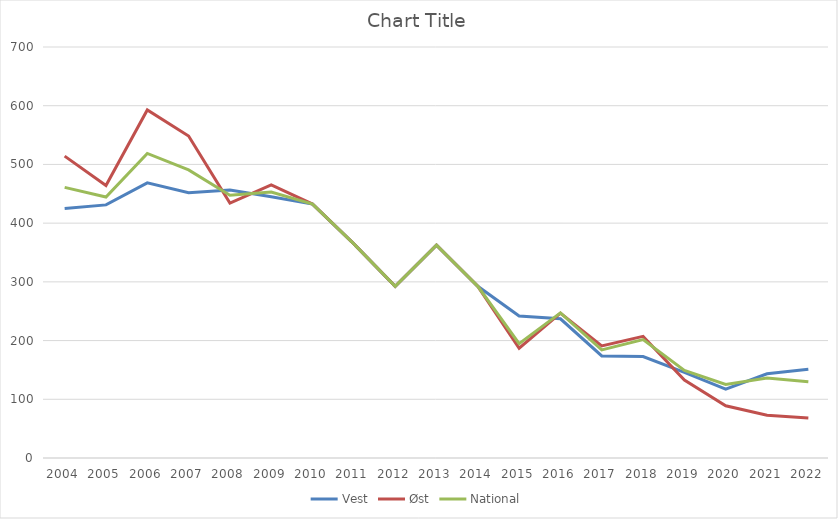
| Category | Vest | Øst | National |
|---|---|---|---|
| 2004.0 | 424.918 | 514.116 | 460.923 |
| 2005.0 | 431.078 | 464.007 | 444.381 |
| 2006.0 | 468.603 | 592.729 | 518.732 |
| 2007.0 | 451.824 | 548.369 | 490.629 |
| 2008.0 | 456.563 | 434.166 | 447.566 |
| 2009.0 | 444.795 | 465.255 | 453.117 |
| 2010.0 | 432.486 | 432.486 | 432.486 |
| 2011.0 | 364.726 | 364.726 | 364.726 |
| 2012.0 | 292.249 | 292.249 | 292.249 |
| 2013.0 | 362.501 | 362.501 | 362.501 |
| 2014.0 | 292.382 | 292.382 | 292.382 |
| 2015.0 | 241.928 | 187.1 | 194.875 |
| 2016.0 | 237.125 | 246.74 | 247.137 |
| 2017.0 | 173.863 | 190.928 | 184.106 |
| 2018.0 | 172.783 | 207.142 | 201.786 |
| 2019.0 | 145.79 | 132.882 | 149.146 |
| 2020.0 | 117.358 | 88.867 | 125.239 |
| 2021.0 | 143.387 | 72.706 | 136.398 |
| 2022.0 | 151.1 | 68.1 | 129.696 |